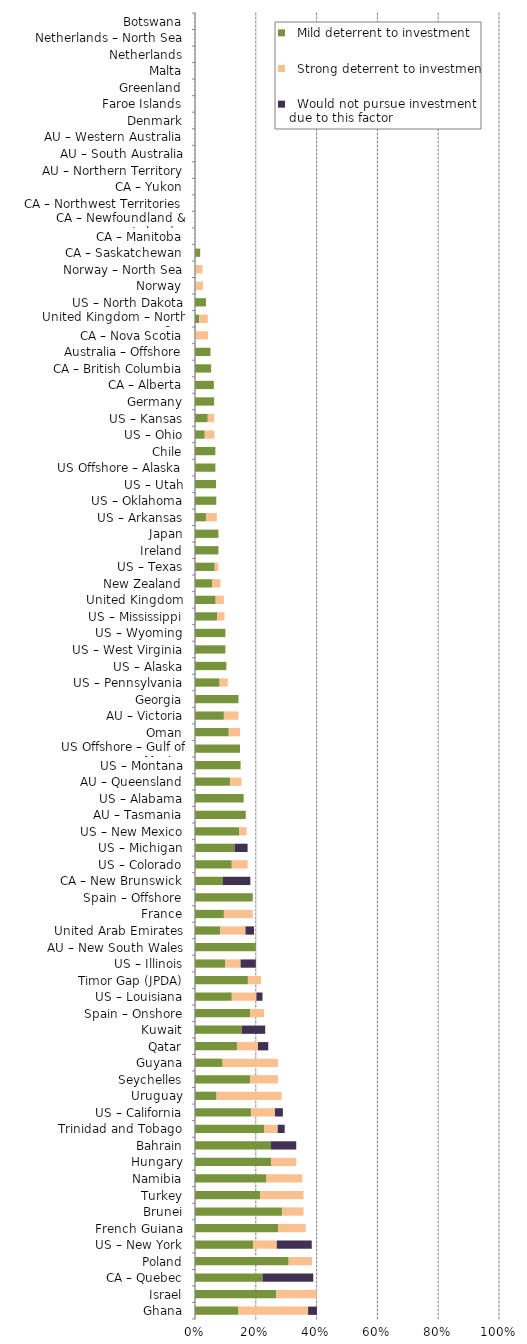
| Category |   Mild deterrent to investment |   Strong deterrent to investment |   Would not pursue investment due to this factor |
|---|---|---|---|
| Ghana | 0.143 | 0.229 | 0.029 |
| Israel | 0.267 | 0.133 | 0 |
| CA – Quebec | 0.222 | 0 | 0.167 |
| Poland | 0.308 | 0.077 | 0 |
| US – New York | 0.192 | 0.077 | 0.115 |
| French Guiana | 0.273 | 0.091 | 0 |
| Brunei | 0.286 | 0.071 | 0 |
| Turkey | 0.214 | 0.143 | 0 |
| Namibia | 0.235 | 0.118 | 0 |
| Hungary | 0.25 | 0.083 | 0 |
| Bahrain | 0.25 | 0 | 0.083 |
| Trinidad and Tobago | 0.227 | 0.045 | 0.023 |
| US – California | 0.184 | 0.079 | 0.026 |
| Uruguay | 0.071 | 0.214 | 0 |
| Seychelles | 0.182 | 0.091 | 0 |
| Guyana | 0.091 | 0.182 | 0 |
| Qatar | 0.138 | 0.069 | 0.034 |
| Kuwait | 0.154 | 0 | 0.077 |
| Spain – Onshore | 0.182 | 0.045 | 0 |
| US – Louisiana | 0.121 | 0.081 | 0.02 |
| Timor Gap (JPDA) | 0.174 | 0.043 | 0 |
| US – Illinois | 0.1 | 0.05 | 0.05 |
| AU – New South Wales | 0.2 | 0 | 0 |
| United Arab Emirates | 0.083 | 0.083 | 0.028 |
| France | 0.095 | 0.095 | 0 |
| Spain – Offshore | 0.19 | 0 | 0 |
| CA – New Brunswick | 0.091 | 0 | 0.091 |
| US – Colorado | 0.121 | 0.052 | 0 |
| US – Michigan | 0.13 | 0 | 0.043 |
| US – New Mexico | 0.146 | 0.024 | 0 |
| AU – Tasmania | 0.167 | 0 | 0 |
| US – Alabama | 0.16 | 0 | 0 |
| AU – Queensland | 0.115 | 0.038 | 0 |
| US – Montana | 0.15 | 0 | 0 |
| US Offshore – Gulf of Mexico | 0.148 | 0 | 0 |
| Oman | 0.111 | 0.037 | 0 |
| AU – Victoria | 0.095 | 0.048 | 0 |
| Georgia | 0.143 | 0 | 0 |
| US – Pennsylvania | 0.081 | 0.027 | 0 |
| US – Alaska | 0.103 | 0 | 0 |
| US – West Virginia | 0.1 | 0 | 0 |
| US – Wyoming | 0.1 | 0 | 0 |
| US – Mississippi | 0.073 | 0.024 | 0 |
| United Kingdom | 0.068 | 0.027 | 0 |
| New Zealand | 0.056 | 0.028 | 0 |
| US – Texas | 0.065 | 0.012 | 0 |
| Ireland | 0.077 | 0 | 0 |
| Japan | 0.077 | 0 | 0 |
| US – Arkansas | 0.036 | 0.036 | 0 |
| US – Oklahoma | 0.07 | 0 | 0 |
| US – Utah | 0.069 | 0 | 0 |
| US Offshore – Alaska | 0.067 | 0 | 0 |
| Chile | 0.067 | 0 | 0 |
| US – Ohio | 0.032 | 0.032 | 0 |
| US – Kansas | 0.042 | 0.021 | 0 |
| Germany | 0.063 | 0 | 0 |
| CA – Alberta | 0.062 | 0 | 0 |
| CA – British Columbia | 0.053 | 0 | 0 |
| Australia – Offshore | 0.051 | 0 | 0 |
| CA – Nova Scotia | 0 | 0.043 | 0 |
| United Kingdom – North Sea | 0.014 | 0.028 | 0 |
| US – North Dakota | 0.036 | 0 | 0 |
| Norway | 0 | 0.026 | 0 |
| Norway – North Sea | 0 | 0.025 | 0 |
| CA – Saskatchewan | 0.017 | 0 | 0 |
| CA – Manitoba | 0 | 0 | 0 |
| CA – Newfoundland & Labrador | 0 | 0 | 0 |
| CA – Northwest Territories | 0 | 0 | 0 |
| CA – Yukon | 0 | 0 | 0 |
| AU – Northern Territory | 0 | 0 | 0 |
| AU – South Australia | 0 | 0 | 0 |
| AU – Western Australia | 0 | 0 | 0 |
| Denmark | 0 | 0 | 0 |
| Faroe Islands | 0 | 0 | 0 |
| Greenland | 0 | 0 | 0 |
| Malta | 0 | 0 | 0 |
| Netherlands | 0 | 0 | 0 |
| Netherlands – North Sea | 0 | 0 | 0 |
| Botswana | 0 | 0 | 0 |